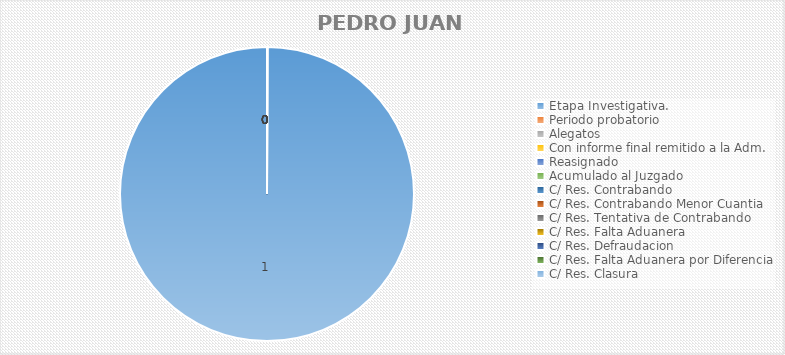
| Category | Series 1 |
|---|---|
| Etapa Investigativa. | 1 |
| Periodo probatorio | 0 |
| Alegatos | 0 |
| Con informe final remitido a la Adm. | 0 |
| Reasignado | 0 |
| Acumulado al Juzgado | 0 |
| C/ Res. Contrabando | 0 |
| C/ Res. Contrabando Menor Cuantia | 0 |
| C/ Res. Tentativa de Contrabando | 0 |
| C/ Res. Falta Aduanera | 0 |
| C/ Res. Defraudacion | 0 |
| C/ Res. Falta Aduanera por Diferencia | 0 |
| C/ Res. Clasura | 0 |